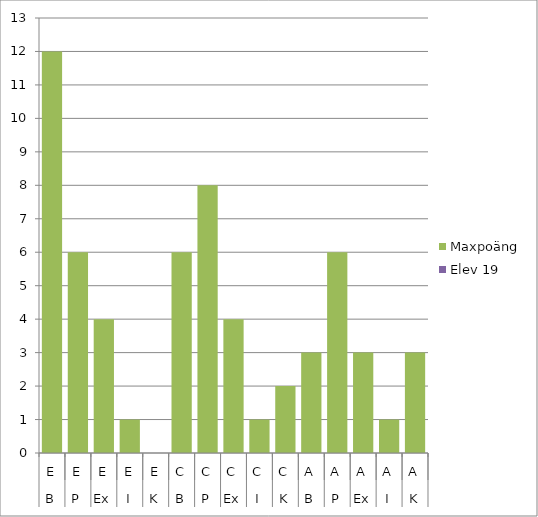
| Category | Maxpoäng | Elev 19 |
|---|---|---|
| 0 | 12 | 0 |
| 1 | 6 | 0 |
| 2 | 4 | 0 |
| 3 | 1 | 0 |
| 4 | 0 | 0 |
| 5 | 6 | 0 |
| 6 | 8 | 0 |
| 7 | 4 | 0 |
| 8 | 1 | 0 |
| 9 | 2 | 0 |
| 10 | 3 | 0 |
| 11 | 6 | 0 |
| 12 | 3 | 0 |
| 13 | 1 | 0 |
| 14 | 3 | 0 |